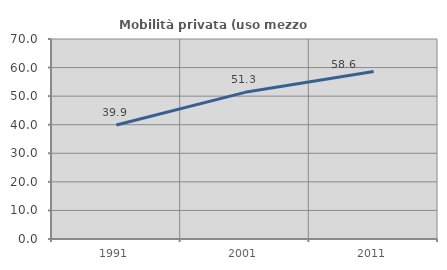
| Category | Mobilità privata (uso mezzo privato) |
|---|---|
| 1991.0 | 39.919 |
| 2001.0 | 51.329 |
| 2011.0 | 58.607 |